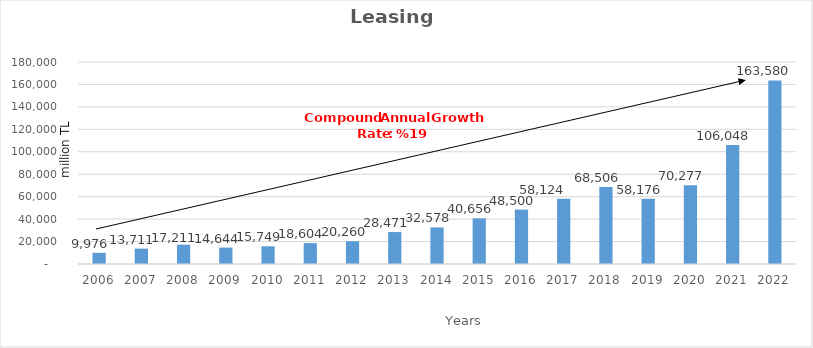
| Category | Leasing |
|---|---|
| 2006.0 | 9976.07 |
| 2007.0 | 13710.562 |
| 2008.0 | 17210.614 |
| 2009.0 | 14644.05 |
| 2010.0 | 15748.853 |
| 2011.0 | 18604.083 |
| 2012.0 | 20259.96 |
| 2013.0 | 28470.82 |
| 2014.0 | 32578 |
| 2015.0 | 40656 |
| 2016.0 | 48500 |
| 2017.0 | 58124 |
| 2018.0 | 68506 |
| 2019.0 | 58176 |
| 2020.0 | 70277 |
| 2021.0 | 106048 |
| 2022.0 | 163580 |